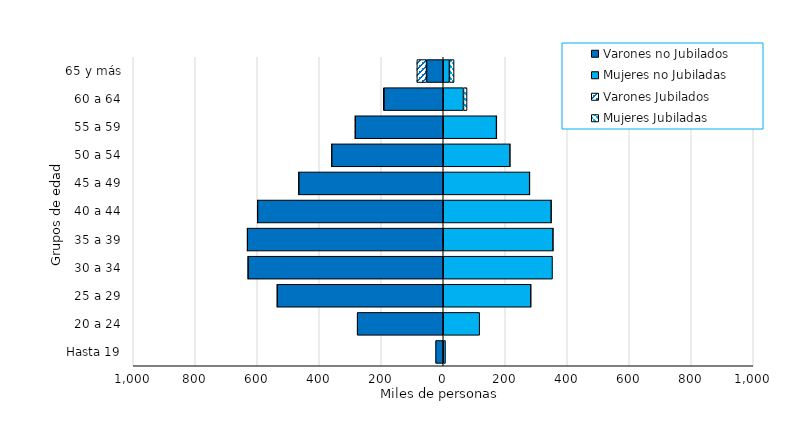
| Category | Varones no Jubilados | Mujeres no Jubiladas | Varones Jubilados | Mujeres Jubiladas |
|---|---|---|---|---|
| Hasta 19 | -24564 | 7215 | 0 | 0 |
| 20 a 24 | -277697 | 117441 | 0 | 0 |
| 25 a 29 | -535916 | 282793 | -2 | 1 |
| 30 a 34 | -629913 | 352472 | -2 | 0 |
| 35 a 39 | -632120 | 354399 | -12 | 6 |
| 40 a 44 | -599192 | 348501 | -60 | 10 |
| 45 a 49 | -466352 | 278798 | -142 | 28 |
| 50 a 54 | -359949 | 215504 | -316 | 81 |
| 55 a 59 | -283957 | 171828 | -939 | 457 |
| 60 a 64 | -191360 | 65283 | -2257 | 11501 |
| 65 y más | -53916 | 19897 | -31262 | 15009 |